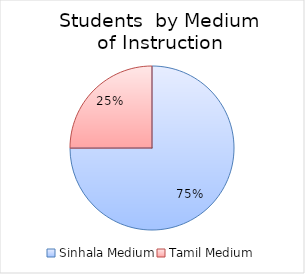
| Category | Series 0 |
|---|---|
| Sinhala Medium | 3123281 |
| Tamil Medium | 1042674 |